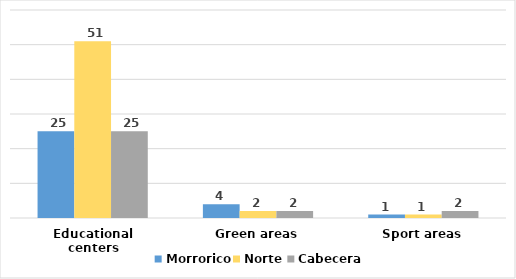
| Category | Morrorico | Norte | Cabecera |
|---|---|---|---|
| Educational centers | 25 | 51 | 25 |
| Green areas | 4 | 2 | 2 |
| Sport areas | 1 | 1 | 2 |